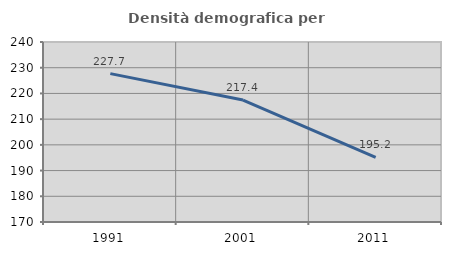
| Category | Densità demografica |
|---|---|
| 1991.0 | 227.701 |
| 2001.0 | 217.429 |
| 2011.0 | 195.172 |